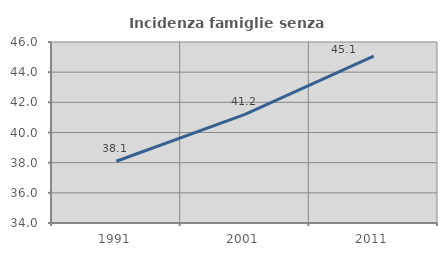
| Category | Incidenza famiglie senza nuclei |
|---|---|
| 1991.0 | 38.095 |
| 2001.0 | 41.199 |
| 2011.0 | 45.063 |